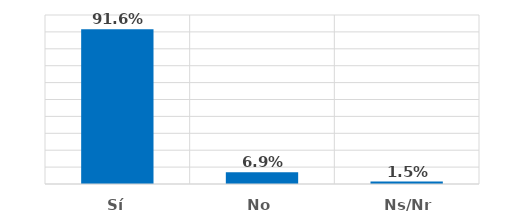
| Category | Series 0 |
|---|---|
| Sí | 0.916 |
| No | 0.069 |
| Ns/Nr | 0.015 |